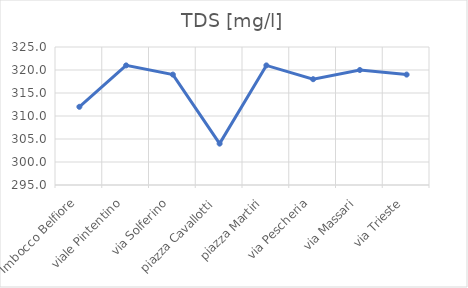
| Category | TDS [mg/l] |
|---|---|
| Imbocco Belfiore | 312 |
| viale Pintentino | 321 |
| via Solferino | 319 |
| piazza Cavallotti | 304 |
| piazza Martiri | 321 |
| via Pescheria | 318 |
| via Massari | 320 |
| via Trieste | 319 |